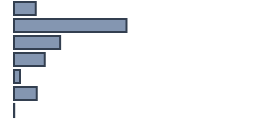
| Category | Percentatge |
|---|---|
| 0 | 9.043 |
| 1 | 46.87 |
| 2 | 19.217 |
| 3 | 12.826 |
| 4 | 2.478 |
| 5 | 9.478 |
| 6 | 0.087 |